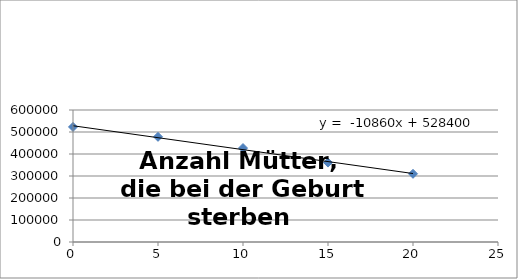
| Category | Series 0 |
|---|---|
| 0.0 | 523000 |
| 5.0 | 478000 |
| 10.0 | 427000 |
| 15.0 | 361000 |
| 20.0 | 310000 |